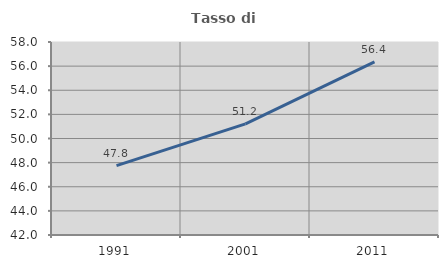
| Category | Tasso di occupazione   |
|---|---|
| 1991.0 | 47.756 |
| 2001.0 | 51.215 |
| 2011.0 | 56.357 |